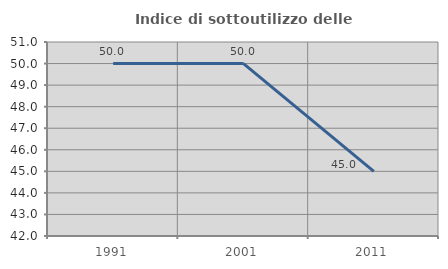
| Category | Indice di sottoutilizzo delle abitazioni  |
|---|---|
| 1991.0 | 50 |
| 2001.0 | 50 |
| 2011.0 | 45 |